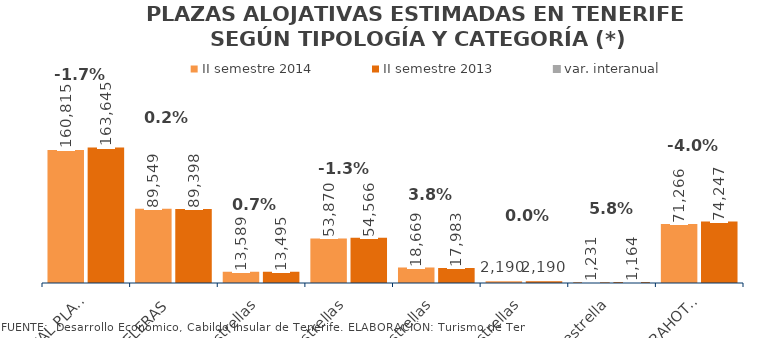
| Category | II semestre 2014 | II semestre 2013 |
|---|---|---|
| TOTAL PLAZAS | 160815 | 163645 |
| HOTELERAS | 89549 | 89398 |
| 5 estrellas | 13589 | 13495 |
| 4 estrellas | 53870 | 54566 |
| 3 estrellas | 18669 | 17983 |
| 2 estrellas | 2190 | 2190 |
| 1 estrella | 1231 | 1164 |
| EXTRAHOTELERAS | 71266 | 74247 |